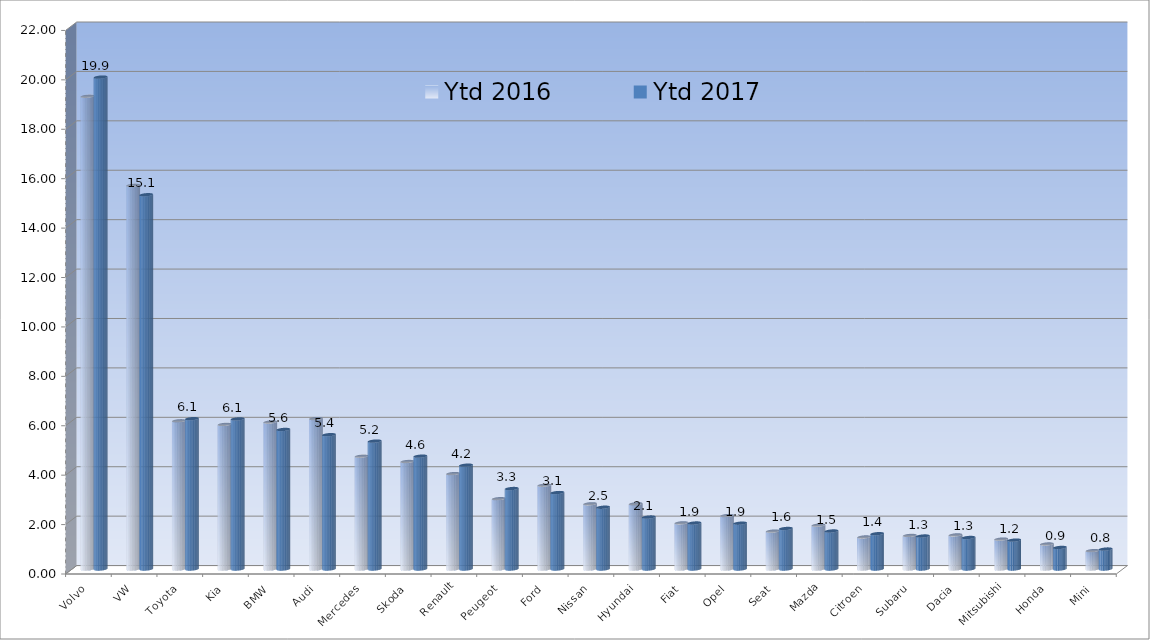
| Category | Ytd 2016 | Ytd 2017 |
|---|---|---|
| Volvo | 19.134 | 19.909 |
| VW | 15.531 | 15.148 |
| Toyota | 5.998 | 6.085 |
| Kia | 5.852 | 6.074 |
| BMW | 5.948 | 5.648 |
| Audi | 6.087 | 5.437 |
| Mercedes | 4.566 | 5.177 |
| Skoda | 4.351 | 4.567 |
| Renault | 3.861 | 4.202 |
| Peugeot | 2.846 | 3.256 |
| Ford | 3.392 | 3.094 |
| Nissan | 2.638 | 2.5 |
| Hyundai | 2.639 | 2.103 |
| Fiat | 1.867 | 1.861 |
| Opel | 2.162 | 1.854 |
| Seat | 1.533 | 1.64 |
| Mazda | 1.775 | 1.538 |
| Citroen | 1.296 | 1.429 |
| Subaru | 1.359 | 1.335 |
| Dacia | 1.379 | 1.275 |
| Mitsubishi | 1.209 | 1.169 |
| Honda | 1.012 | 0.872 |
| Mini | 0.743 | 0.807 |